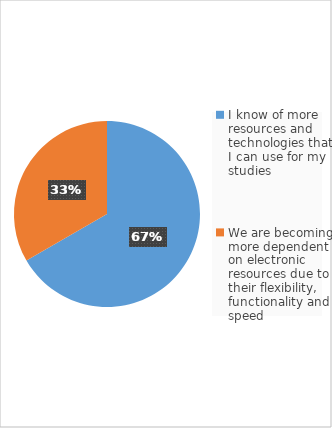
| Category | Series 0 |
|---|---|
| I know of more resources and technologies that I can use for my studies | 4 |
| We are becoming more dependent on electronic resources due to their flexibility, functionality and speed | 2 |